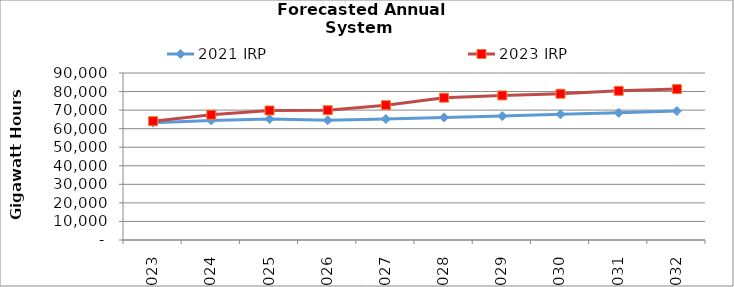
| Category | 2021 IRP | 2023 IRP |
|---|---|---|
| 2023.0 | 63242.99 | 64032.93 |
| 2024.0 | 64451.31 | 67499.27 |
| 2025.0 | 65162.26 | 69805.06 |
| 2026.0 | 64527.03 | 69938.42 |
| 2027.0 | 65178.4 | 72649.77 |
| 2028.0 | 66083.42 | 76681.12 |
| 2029.0 | 66768.66 | 77919.28 |
| 2030.0 | 67723.21 | 78811.84 |
| 2031.0 | 68528.65 | 80380.69 |
| 2032.0 | 69507.21 | 81321.78 |